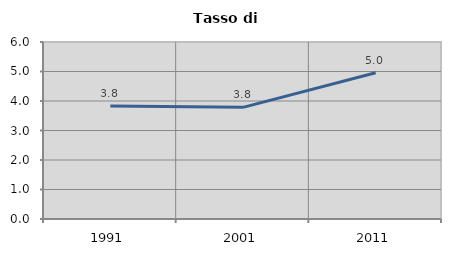
| Category | Tasso di disoccupazione   |
|---|---|
| 1991.0 | 3.833 |
| 2001.0 | 3.785 |
| 2011.0 | 4.96 |